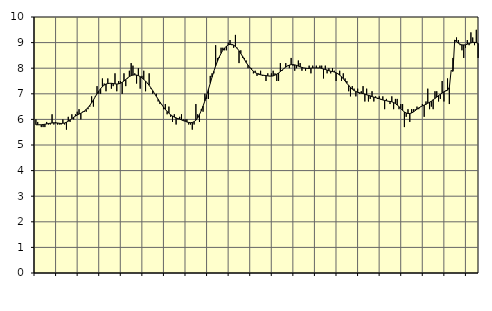
| Category | Piggar | Series 1 |
|---|---|---|
| nan | 6 | 5.79 |
| 1.0 | 5.9 | 5.79 |
| 1.0 | 5.8 | 5.79 |
| 1.0 | 5.7 | 5.79 |
| 1.0 | 5.7 | 5.8 |
| 1.0 | 5.7 | 5.81 |
| 1.0 | 5.9 | 5.82 |
| 1.0 | 5.8 | 5.84 |
| 1.0 | 5.8 | 5.85 |
| 1.0 | 6.2 | 5.86 |
| 1.0 | 5.8 | 5.87 |
| 1.0 | 5.9 | 5.86 |
| nan | 5.8 | 5.86 |
| 2.0 | 5.8 | 5.85 |
| 2.0 | 5.8 | 5.84 |
| 2.0 | 6 | 5.85 |
| 2.0 | 5.8 | 5.86 |
| 2.0 | 5.6 | 5.89 |
| 2.0 | 6.1 | 5.93 |
| 2.0 | 5.9 | 5.98 |
| 2.0 | 6.2 | 6.03 |
| 2.0 | 6 | 6.08 |
| 2.0 | 6.2 | 6.13 |
| 2.0 | 6.3 | 6.17 |
| nan | 6.4 | 6.21 |
| 3.0 | 6 | 6.24 |
| 3.0 | 6.3 | 6.28 |
| 3.0 | 6.3 | 6.33 |
| 3.0 | 6.3 | 6.39 |
| 3.0 | 6.4 | 6.46 |
| 3.0 | 6.5 | 6.55 |
| 3.0 | 6.9 | 6.65 |
| 3.0 | 6.5 | 6.76 |
| 3.0 | 6.9 | 6.88 |
| 3.0 | 7.3 | 7 |
| 3.0 | 7 | 7.11 |
| nan | 7 | 7.2 |
| 4.0 | 7.6 | 7.28 |
| 4.0 | 7.4 | 7.34 |
| 4.0 | 7.1 | 7.38 |
| 4.0 | 7.6 | 7.4 |
| 4.0 | 7.4 | 7.41 |
| 4.0 | 7.2 | 7.41 |
| 4.0 | 7.3 | 7.4 |
| 4.0 | 7.8 | 7.39 |
| 4.0 | 7.1 | 7.38 |
| 4.0 | 7.5 | 7.39 |
| 4.0 | 7.5 | 7.41 |
| nan | 7 | 7.45 |
| 5.0 | 7.8 | 7.5 |
| 5.0 | 7.3 | 7.56 |
| 5.0 | 7.6 | 7.62 |
| 5.0 | 7.9 | 7.67 |
| 5.0 | 8.2 | 7.71 |
| 5.0 | 8.1 | 7.73 |
| 5.0 | 7.8 | 7.74 |
| 5.0 | 7.4 | 7.73 |
| 5.0 | 8 | 7.71 |
| 5.0 | 7.2 | 7.67 |
| 5.0 | 7.7 | 7.62 |
| nan | 7.9 | 7.56 |
| 6.0 | 7.1 | 7.5 |
| 6.0 | 7.4 | 7.42 |
| 6.0 | 7.8 | 7.33 |
| 6.0 | 7.2 | 7.23 |
| 6.0 | 7 | 7.12 |
| 6.0 | 7 | 7.01 |
| 6.0 | 7 | 6.9 |
| 6.0 | 6.7 | 6.79 |
| 6.0 | 6.6 | 6.68 |
| 6.0 | 6.6 | 6.58 |
| 6.0 | 6.4 | 6.48 |
| nan | 6.6 | 6.39 |
| 7.0 | 6.2 | 6.31 |
| 7.0 | 6.5 | 6.24 |
| 7.0 | 6.1 | 6.18 |
| 7.0 | 5.9 | 6.13 |
| 7.0 | 6.2 | 6.09 |
| 7.0 | 5.8 | 6.06 |
| 7.0 | 6 | 6.03 |
| 7.0 | 6.1 | 6.01 |
| 7.0 | 6.2 | 5.98 |
| 7.0 | 6 | 5.95 |
| 7.0 | 6 | 5.93 |
| nan | 6 | 5.9 |
| 8.0 | 5.8 | 5.88 |
| 8.0 | 5.8 | 5.87 |
| 8.0 | 5.6 | 5.88 |
| 8.0 | 5.8 | 5.91 |
| 8.0 | 6.6 | 5.97 |
| 8.0 | 6.2 | 6.06 |
| 8.0 | 5.9 | 6.19 |
| 8.0 | 6.4 | 6.34 |
| 8.0 | 6.3 | 6.52 |
| 8.0 | 7 | 6.72 |
| 8.0 | 6.8 | 6.95 |
| nan | 6.8 | 7.18 |
| 9.0 | 7.7 | 7.41 |
| 9.0 | 7.8 | 7.65 |
| 9.0 | 7.8 | 7.88 |
| 9.0 | 8.9 | 8.09 |
| 9.0 | 8.4 | 8.27 |
| 9.0 | 8.4 | 8.44 |
| 9.0 | 8.8 | 8.58 |
| 9.0 | 8.8 | 8.7 |
| 9.0 | 8.7 | 8.79 |
| 9.0 | 8.7 | 8.86 |
| 9.0 | 9 | 8.91 |
| nan | 9.1 | 8.93 |
| 10.0 | 8.9 | 8.93 |
| 10.0 | 8.8 | 8.9 |
| 10.0 | 9.3 | 8.85 |
| 10.0 | 8.8 | 8.77 |
| 10.0 | 8.2 | 8.68 |
| 10.0 | 8.7 | 8.57 |
| 10.0 | 8.4 | 8.46 |
| 10.0 | 8.4 | 8.34 |
| 10.0 | 8.3 | 8.22 |
| 10.0 | 8 | 8.12 |
| 10.0 | 8 | 8.03 |
| nan | 8 | 7.95 |
| 11.0 | 7.8 | 7.88 |
| 11.0 | 7.9 | 7.83 |
| 11.0 | 7.7 | 7.79 |
| 11.0 | 7.8 | 7.76 |
| 11.0 | 7.9 | 7.74 |
| 11.0 | 7.7 | 7.73 |
| 11.0 | 7.7 | 7.72 |
| 11.0 | 7.5 | 7.71 |
| 11.0 | 7.8 | 7.7 |
| 11.0 | 7.7 | 7.69 |
| 11.0 | 7.8 | 7.69 |
| nan | 7.9 | 7.7 |
| 12.0 | 7.8 | 7.73 |
| 12.0 | 7.5 | 7.77 |
| 12.0 | 7.5 | 7.81 |
| 12.0 | 8.2 | 7.87 |
| 12.0 | 7.9 | 7.93 |
| 12.0 | 8 | 7.99 |
| 12.0 | 8.2 | 8.04 |
| 12.0 | 8.1 | 8.09 |
| 12.0 | 8 | 8.12 |
| 12.0 | 8.4 | 8.14 |
| 12.0 | 8.1 | 8.14 |
| nan | 7.9 | 8.13 |
| 13.0 | 8 | 8.11 |
| 13.0 | 8.3 | 8.08 |
| 13.0 | 8.2 | 8.05 |
| 13.0 | 7.9 | 8.03 |
| 13.0 | 8 | 8.01 |
| 13.0 | 7.9 | 8 |
| 13.0 | 8 | 7.99 |
| 13.0 | 8.1 | 7.99 |
| 13.0 | 7.8 | 8 |
| 13.0 | 8.1 | 8.01 |
| 13.0 | 8 | 8.01 |
| nan | 8.1 | 8.01 |
| 14.0 | 8 | 8.01 |
| 14.0 | 8.1 | 8.01 |
| 14.0 | 8.1 | 7.99 |
| 14.0 | 7.6 | 7.97 |
| 14.0 | 8.1 | 7.95 |
| 14.0 | 7.8 | 7.93 |
| 14.0 | 8 | 7.9 |
| 14.0 | 7.8 | 7.88 |
| 14.0 | 8 | 7.87 |
| 14.0 | 7.9 | 7.85 |
| 14.0 | 7.5 | 7.82 |
| nan | 7.8 | 7.78 |
| 15.0 | 7.9 | 7.73 |
| 15.0 | 7.5 | 7.67 |
| 15.0 | 7.8 | 7.59 |
| 15.0 | 7.6 | 7.5 |
| 15.0 | 7.5 | 7.41 |
| 15.0 | 7.1 | 7.33 |
| 15.0 | 6.9 | 7.25 |
| 15.0 | 7.3 | 7.18 |
| 15.0 | 7.2 | 7.13 |
| 15.0 | 6.9 | 7.09 |
| 15.0 | 7.2 | 7.06 |
| nan | 7 | 7.04 |
| 16.0 | 7.1 | 7.02 |
| 16.0 | 7.3 | 7.01 |
| 16.0 | 6.7 | 6.99 |
| 16.0 | 7.2 | 6.96 |
| 16.0 | 6.7 | 6.94 |
| 16.0 | 6.8 | 6.92 |
| 16.0 | 7.1 | 6.89 |
| 16.0 | 6.7 | 6.87 |
| 16.0 | 6.9 | 6.85 |
| 16.0 | 6.8 | 6.83 |
| 16.0 | 6.9 | 6.81 |
| nan | 6.8 | 6.78 |
| 17.0 | 6.9 | 6.76 |
| 17.0 | 6.4 | 6.74 |
| 17.0 | 6.8 | 6.73 |
| 17.0 | 6.7 | 6.71 |
| 17.0 | 6.6 | 6.7 |
| 17.0 | 6.9 | 6.69 |
| 17.0 | 6.4 | 6.66 |
| 17.0 | 6.8 | 6.62 |
| 17.0 | 6.8 | 6.56 |
| 17.0 | 6.4 | 6.5 |
| 17.0 | 6.6 | 6.42 |
| nan | 6.6 | 6.35 |
| 18.0 | 5.7 | 6.29 |
| 18.0 | 6.1 | 6.25 |
| 18.0 | 6.4 | 6.23 |
| 18.0 | 5.9 | 6.23 |
| 18.0 | 6.4 | 6.25 |
| 18.0 | 6.4 | 6.29 |
| 18.0 | 6.4 | 6.34 |
| 18.0 | 6.5 | 6.4 |
| 18.0 | 6.4 | 6.45 |
| 18.0 | 6.5 | 6.49 |
| 18.0 | 6.6 | 6.53 |
| nan | 6.1 | 6.56 |
| 19.0 | 6.7 | 6.59 |
| 19.0 | 7.2 | 6.63 |
| 19.0 | 6.4 | 6.67 |
| 19.0 | 6.5 | 6.71 |
| 19.0 | 6.4 | 6.77 |
| 19.0 | 7.1 | 6.82 |
| 19.0 | 7.1 | 6.87 |
| 19.0 | 6.7 | 6.93 |
| 19.0 | 6.8 | 6.98 |
| 19.0 | 7.5 | 7.03 |
| 19.0 | 6.7 | 7.08 |
| nan | 7.1 | 7.12 |
| 20.0 | 7.6 | 7.14 |
| 20.0 | 6.6 | 7.25 |
| 20.0 | 7.9 | 7.91 |
| 20.0 | 8.4 | 7.88 |
| 20.0 | 9 | 9.1 |
| 20.0 | 9.2 | 9.04 |
| 20.0 | 9.1 | 8.98 |
| 20.0 | 8.9 | 8.94 |
| 20.0 | 8.7 | 8.91 |
| 20.0 | 8.4 | 8.91 |
| 20.0 | 8.8 | 8.91 |
| nan | 9.1 | 8.94 |
| 21.0 | 8.9 | 8.96 |
| 21.0 | 9.4 | 8.99 |
| 21.0 | 9.2 | 9.01 |
| 21.0 | 8.9 | 9.01 |
| 21.0 | 9.5 | 9 |
| 21.0 | 8.4 | 8.97 |